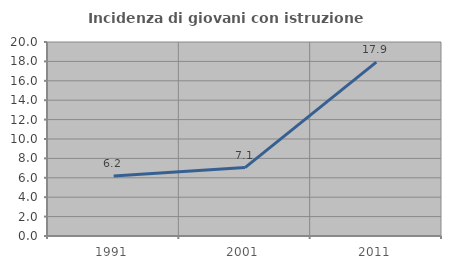
| Category | Incidenza di giovani con istruzione universitaria |
|---|---|
| 1991.0 | 6.182 |
| 2001.0 | 7.057 |
| 2011.0 | 17.932 |